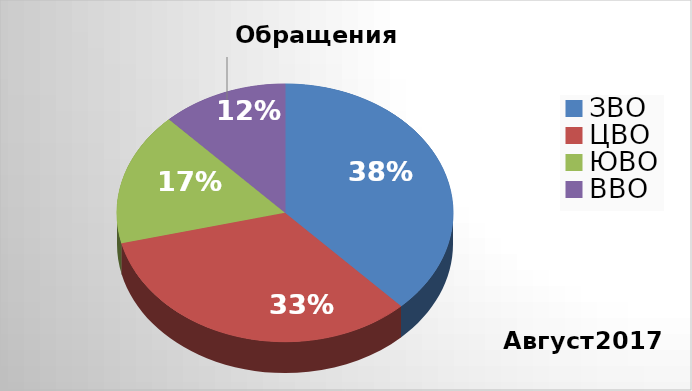
| Category | Series 0 |
|---|---|
| ЗВО | 25 |
| ЦВО | 22 |
| ЮВО | 11 |
| ВВО | 8 |